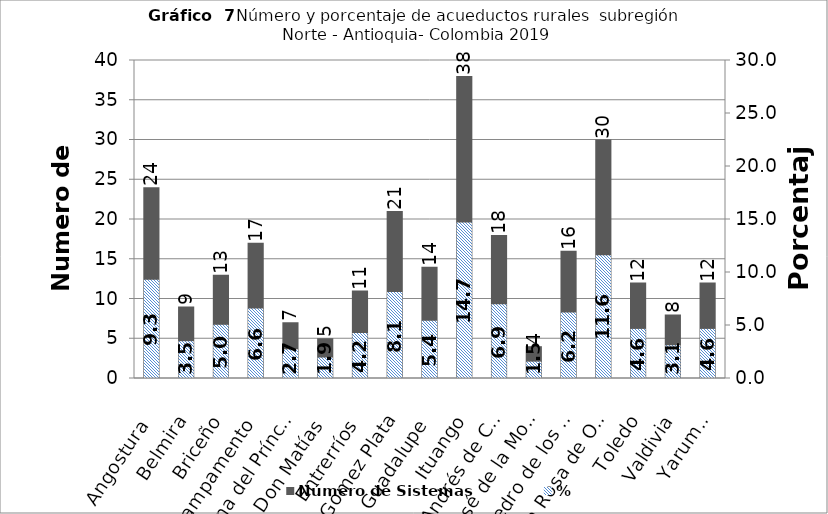
| Category | Número de Sistemas |
|---|---|
| Angostura | 24 |
| Belmira | 9 |
| Briceño | 13 |
| Campamento | 17 |
| Carolina del Príncipe | 7 |
| Don Matías | 5 |
| Entrerríos | 11 |
| Gómez Plata | 21 |
| Guadalupe | 14 |
| Ituango | 38 |
| San Andrés de Cuerquia | 18 |
| San José de la Montaña | 4 |
| San Pedro de los Milagros | 16 |
| Santa Rosa de Osos | 30 |
| Toledo | 12 |
| Valdivia | 8 |
| Yarumal | 12 |